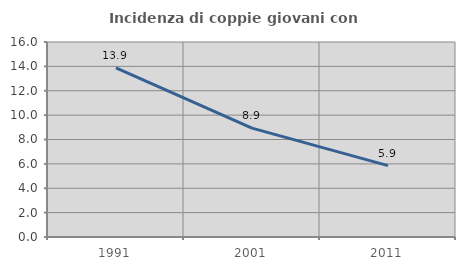
| Category | Incidenza di coppie giovani con figli |
|---|---|
| 1991.0 | 13.875 |
| 2001.0 | 8.937 |
| 2011.0 | 5.852 |